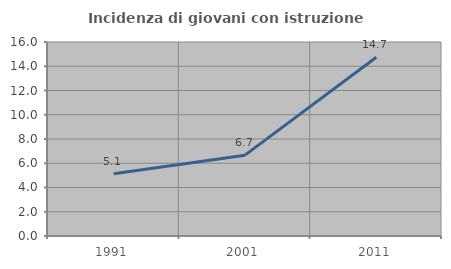
| Category | Incidenza di giovani con istruzione universitaria |
|---|---|
| 1991.0 | 5.128 |
| 2001.0 | 6.667 |
| 2011.0 | 14.737 |